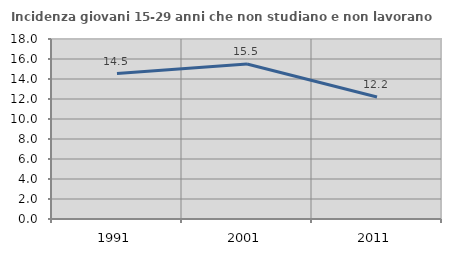
| Category | Incidenza giovani 15-29 anni che non studiano e non lavorano  |
|---|---|
| 1991.0 | 14.545 |
| 2001.0 | 15.493 |
| 2011.0 | 12.195 |